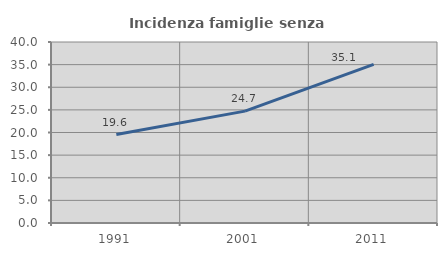
| Category | Incidenza famiglie senza nuclei |
|---|---|
| 1991.0 | 19.558 |
| 2001.0 | 24.724 |
| 2011.0 | 35.071 |